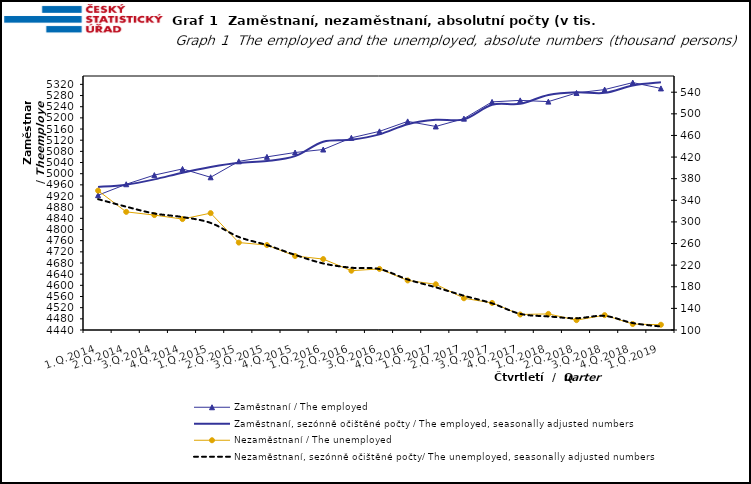
| Category | Zaměstnaní / The employed | Zaměstnaní, sezónně očištěné počty / The employed, seasonally adjusted numbers |
|---|---|---|
| 1.Q.2014 | 4922.963 | 4952.405 |
| 2.Q.2014 | 4962.219 | 4960.65 |
| 3.Q.2014 | 4994.947 | 4979.618 |
| 4.Q.2014 | 5017.051 | 5003.629 |
| 1.Q.2015 | 4987.141 | 5023.827 |
| 2.Q.2015 | 5044.285 | 5038.984 |
| 3.Q.2015 | 5060.3 | 5045.647 |
| 4.Q.2015 | 5075.884 | 5063.085 |
| 1.Q.2016 | 5086.671 | 5114.698 |
| 2.Q.2016 | 5128.493 | 5121.602 |
| 3.Q.2016 | 5151.712 | 5140.967 |
| 4.Q.2016 | 5187.436 | 5177.35 |
| 1.Q.2017 | 5169.203 | 5192.941 |
| 2.Q.2017 | 5197.265 | 5194.555 |
| 3.Q.2017 | 5257.26 | 5246.726 |
| 4.Q.2017 | 5262.691 | 5250.237 |
| 1.Q.2018 | 5258.225 | 5281.99 |
| 2.Q.2018 | 5289.242 | 5291.982 |
| 3.Q.2018 | 5301.361 | 5289.641 |
| 4.Q.2018 | 5326.327 | 5316.128 |
| 1.Q.2019 | 5305.534 | 5327.565 |